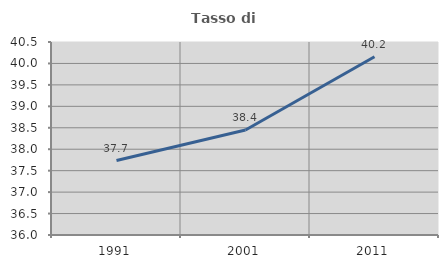
| Category | Tasso di occupazione   |
|---|---|
| 1991.0 | 37.736 |
| 2001.0 | 38.449 |
| 2011.0 | 40.156 |